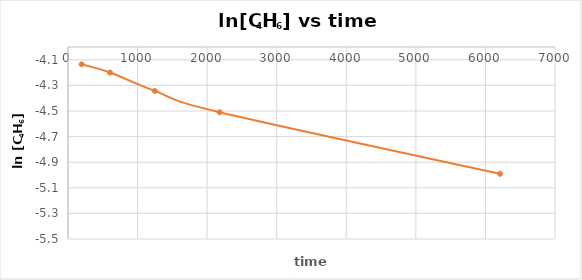
| Category | ln[C4H6] |
|---|---|
| 195.0 | -4.135 |
| 604.0 | -4.2 |
| 1246.0 | -4.343 |
| 2180.0 | -4.51 |
| 6210.0 | -4.991 |